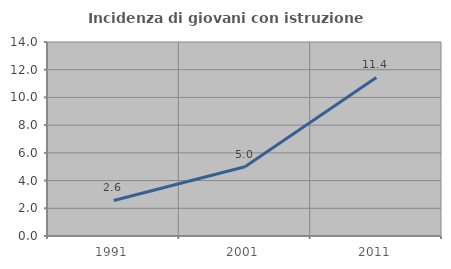
| Category | Incidenza di giovani con istruzione universitaria |
|---|---|
| 1991.0 | 2.564 |
| 2001.0 | 5 |
| 2011.0 | 11.443 |